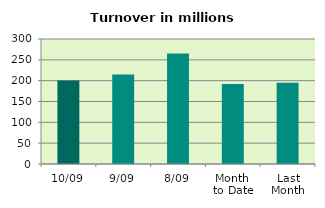
| Category | Series 0 |
|---|---|
| 10/09 | 200.656 |
| 9/09 | 214.693 |
| 8/09 | 265.292 |
| Month 
to Date | 191.952 |
| Last
Month | 194.848 |